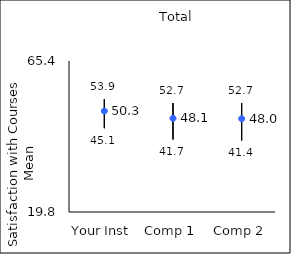
| Category | 25th percentile | 75th percentile | Mean |
|---|---|---|---|
| Your Inst | 45.1 | 53.9 | 50.29 |
| Comp 1 | 41.7 | 52.7 | 48.08 |
| Comp 2 | 41.4 | 52.7 | 47.97 |